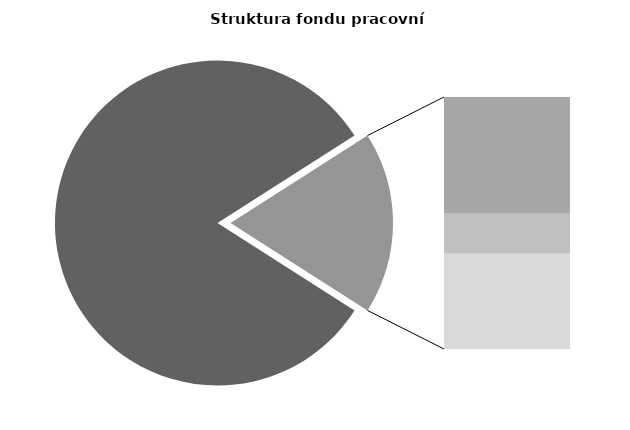
| Category | Series 0 |
|---|---|
| Průměrná měsíční odpracovaná doba bez přesčasu | 141.119 |
| Dovolená | 14.346 |
| Nemoc | 5.035 |
| Jiné | 11.767 |